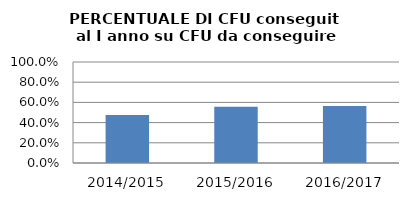
| Category | 2014/2015 2015/2016 2016/2017 |
|---|---|
| 2014/2015 | 0.475 |
| 2015/2016 | 0.558 |
| 2016/2017 | 0.564 |